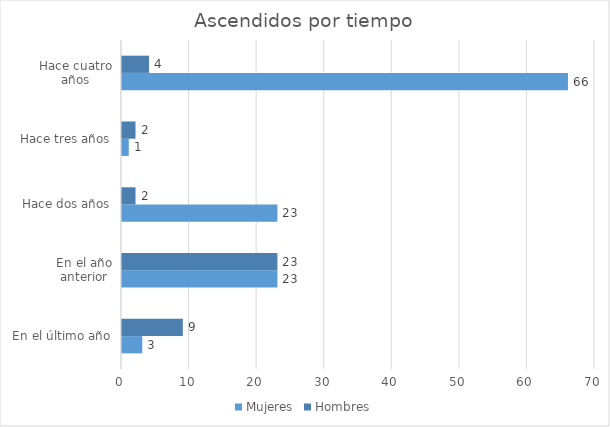
| Category | Mujeres | Hombres |
|---|---|---|
| En el último año | 3 | 9 |
| En el año anterior | 23 | 23 |
| Hace dos años | 23 | 2 |
| Hace tres años | 1 | 2 |
| Hace cuatro años | 66 | 4 |